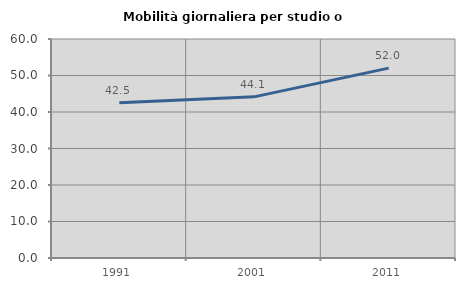
| Category | Mobilità giornaliera per studio o lavoro |
|---|---|
| 1991.0 | 42.516 |
| 2001.0 | 44.149 |
| 2011.0 | 52.02 |